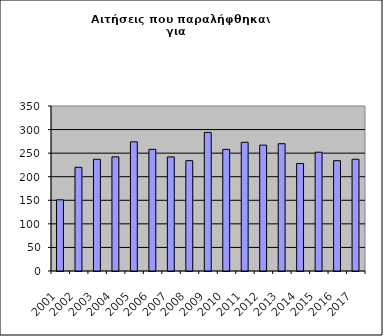
| Category | Series 1 |
|---|---|
| 2001.0 | 151 |
| 2002.0 | 220 |
| 2003.0 | 237 |
| 2004.0 | 242 |
| 2005.0 | 274 |
| 2006.0 | 258 |
| 2007.0 | 242 |
| 2008.0 | 234 |
| 2009.0 | 294 |
| 2010.0 | 258 |
| 2011.0 | 273 |
| 2012.0 | 267 |
| 2013.0 | 270 |
| 2014.0 | 228 |
| 2015.0 | 252 |
| 2016.0 | 234 |
| 2017.0 | 237 |